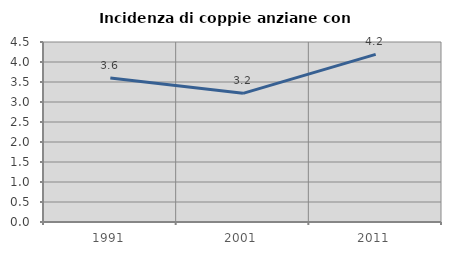
| Category | Incidenza di coppie anziane con figli |
|---|---|
| 1991.0 | 3.601 |
| 2001.0 | 3.216 |
| 2011.0 | 4.19 |